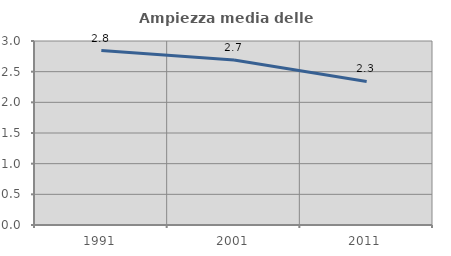
| Category | Ampiezza media delle famiglie |
|---|---|
| 1991.0 | 2.845 |
| 2001.0 | 2.689 |
| 2011.0 | 2.34 |